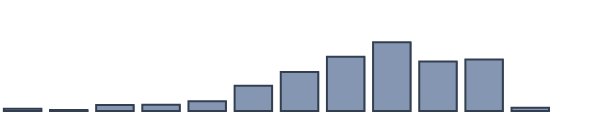
| Category | Series 0 |
|---|---|
| 0 | 0.7 |
| 1 | 0.3 |
| 2 | 1.9 |
| 3 | 2 |
| 4 | 3.1 |
| 5 | 8 |
| 6 | 12.3 |
| 7 | 17.1 |
| 8 | 21.7 |
| 9 | 15.6 |
| 10 | 16.2 |
| 11 | 1 |
| 12 | 0 |